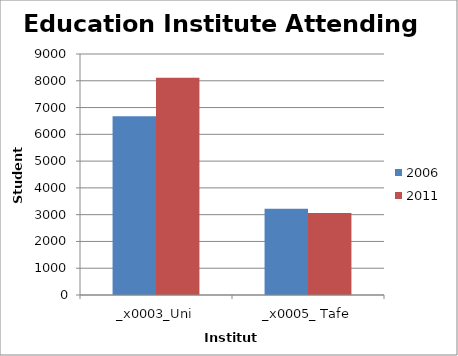
| Category | 2006 | 2011 |
|---|---|---|
| 0 | 6672 | 8113 |
| 1 | 3222 | 3061 |